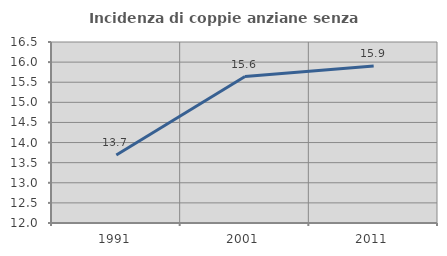
| Category | Incidenza di coppie anziane senza figli  |
|---|---|
| 1991.0 | 13.691 |
| 2001.0 | 15.641 |
| 2011.0 | 15.901 |